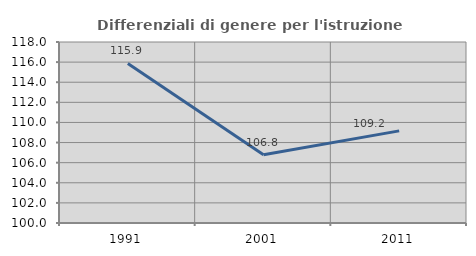
| Category | Differenziali di genere per l'istruzione superiore |
|---|---|
| 1991.0 | 115.866 |
| 2001.0 | 106.78 |
| 2011.0 | 109.163 |